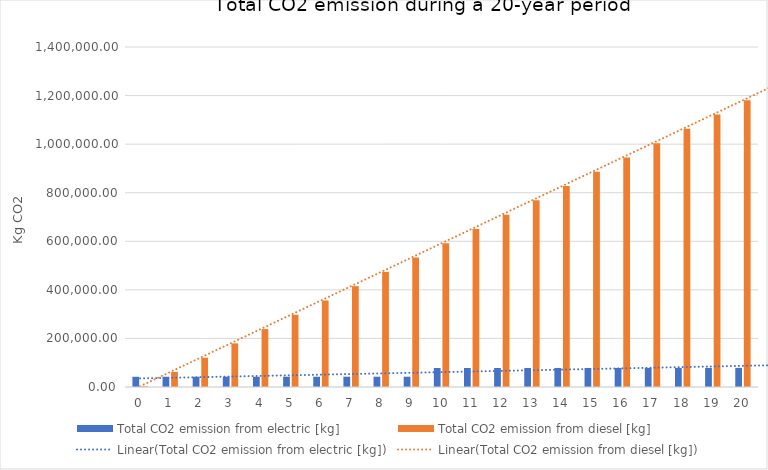
| Category | Total CO2 emission from electric [kg] | Total CO2 emission from diesel [kg] |
|---|---|---|
| 0.0 | 42116.765 | 2931.921 |
| 1.0 | 42151.684 | 61819.032 |
| 2.0 | 42186.603 | 120706.143 |
| 3.0 | 42221.522 | 179593.255 |
| 4.0 | 42256.441 | 238480.366 |
| 5.0 | 42291.36 | 297367.477 |
| 6.0 | 42326.279 | 356254.588 |
| 7.0 | 42361.197 | 415141.699 |
| 8.0 | 42396.116 | 474028.81 |
| 9.0 | 42431.035 | 532915.921 |
| 10.0 | 78263.808 | 591803.032 |
| 11.0 | 78298.727 | 650690.143 |
| 12.0 | 78333.646 | 709577.255 |
| 13.0 | 78368.565 | 768464.366 |
| 14.0 | 78403.484 | 827351.477 |
| 15.0 | 78438.403 | 886238.588 |
| 16.0 | 78473.322 | 945125.699 |
| 17.0 | 78508.241 | 1004012.81 |
| 18.0 | 78543.16 | 1062899.921 |
| 19.0 | 78578.079 | 1121787.032 |
| 20.0 | 78612.998 | 1180674.143 |